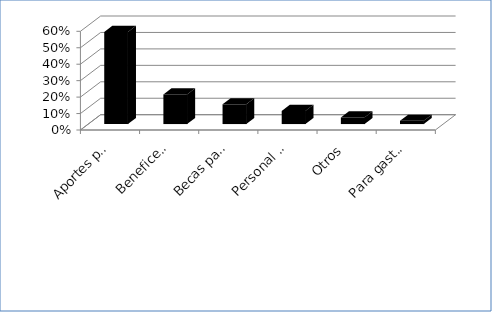
| Category | Series 0 |
|---|---|
| Aportes para templos | 0.56 |
| Beneficencia | 0.18 |
| Becas para estudiantes del Seminario | 0.12 |
| Personal elcesiástico | 0.08 |
| Otros | 0.04 |
| Para gastos del culto | 0.02 |